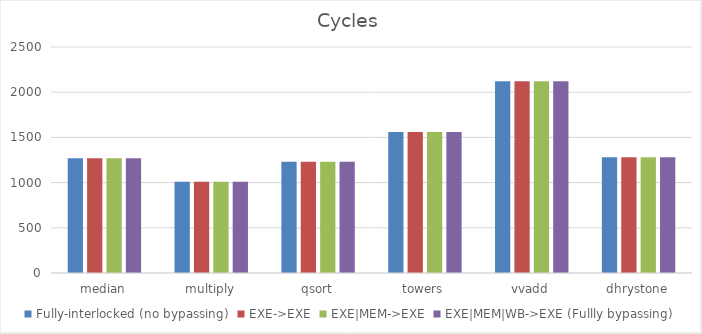
| Category | Fully-interlocked (no bypassing) | EXE->EXE | EXE|MEM->EXE | EXE|MEM|WB->EXE (Fullly bypassing) |
|---|---|---|---|---|
| median | 1270 | 1270 | 1270 | 1270 |
| multiply | 1010 | 1010 | 1010 | 1010 |
| qsort | 1230 | 1230 | 1230 | 1230 |
| towers | 1560 | 1560 | 1560 | 1560 |
| vvadd | 2120 | 2120 | 2120 | 2120 |
| dhrystone | 1280 | 1280 | 1280 | 1280 |